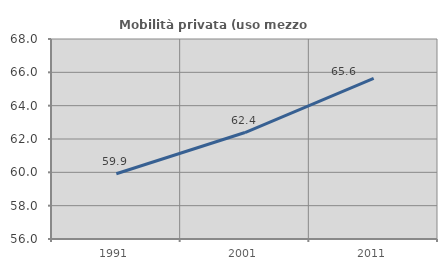
| Category | Mobilità privata (uso mezzo privato) |
|---|---|
| 1991.0 | 59.913 |
| 2001.0 | 62.389 |
| 2011.0 | 65.639 |